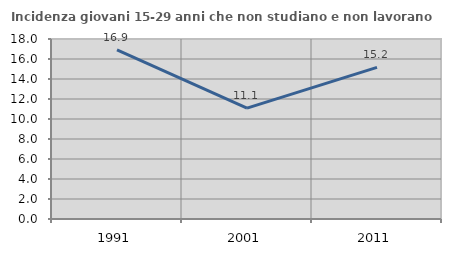
| Category | Incidenza giovani 15-29 anni che non studiano e non lavorano  |
|---|---|
| 1991.0 | 16.918 |
| 2001.0 | 11.089 |
| 2011.0 | 15.164 |